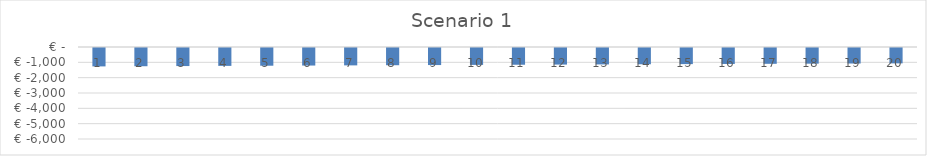
| Category | Series 0 |
|---|---|
| 0 | -1200 |
| 1 | -1188.679 |
| 2 | -1177.465 |
| 3 | -1166.357 |
| 4 | -1155.354 |
| 5 | -1144.454 |
| 6 | -1133.657 |
| 7 | -1122.963 |
| 8 | -1112.369 |
| 9 | -1101.875 |
| 10 | -1091.48 |
| 11 | -1081.183 |
| 12 | -1070.983 |
| 13 | -1060.879 |
| 14 | -1050.871 |
| 15 | -1040.957 |
| 16 | -1031.137 |
| 17 | -1021.409 |
| 18 | -1011.773 |
| 19 | -1002.228 |